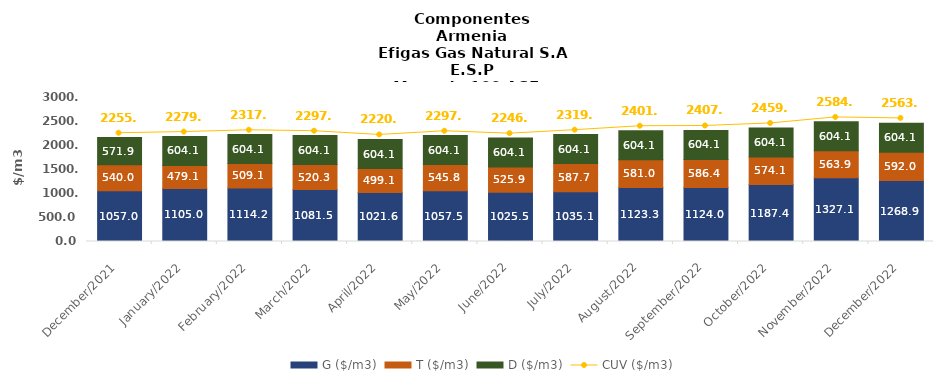
| Category | G ($/m3) | T ($/m3) | D ($/m3) |
|---|---|---|---|
| 2021-12-01 | 1057.02 | 540.03 | 571.94 |
| 2022-01-01 | 1104.95 | 479.06 | 604.09 |
| 2022-02-01 | 1114.19 | 509.07 | 604.09 |
| 2022-03-01 | 1081.46 | 520.29 | 604.09 |
| 2022-04-01 | 1021.55 | 499.13 | 604.09 |
| 2022-05-01 | 1057.51 | 545.79 | 604.09 |
| 2022-06-01 | 1025.45 | 525.86 | 604.09 |
| 2022-07-01 | 1035.13 | 587.69 | 604.09 |
| 2022-08-01 | 1123.29 | 581.03 | 604.09 |
| 2022-09-01 | 1123.97 | 586.38 | 604.09 |
| 2022-10-01 | 1187.44 | 574.12 | 604.09 |
| 2022-11-01 | 1327.14 | 563.85 | 604.09 |
| 2022-12-01 | 1268.91 | 592.03 | 604.09 |